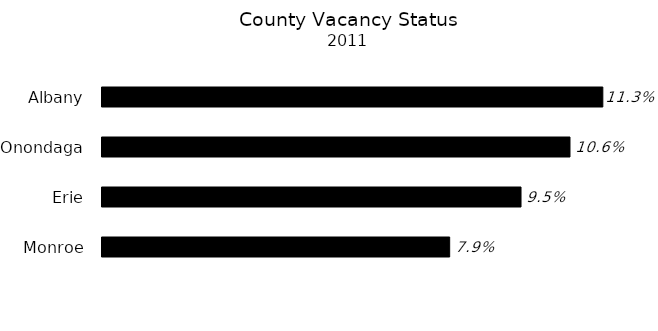
| Category | Series 0 |
|---|---|
| Monroe | 0.079 |
| Erie | 0.095 |
| Onondaga | 0.106 |
| Albany | 0.113 |